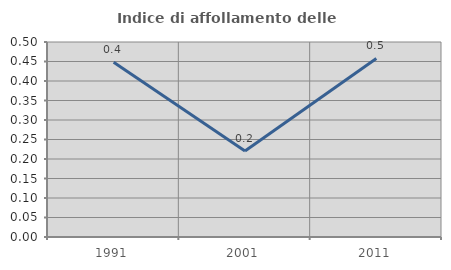
| Category | Indice di affollamento delle abitazioni  |
|---|---|
| 1991.0 | 0.448 |
| 2001.0 | 0.22 |
| 2011.0 | 0.458 |